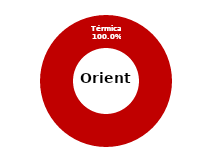
| Category | Oriente |
|---|---|
| Eólica | 0 |
| Hidráulica | 0 |
| Solar | 0 |
| Térmica | 32.609 |